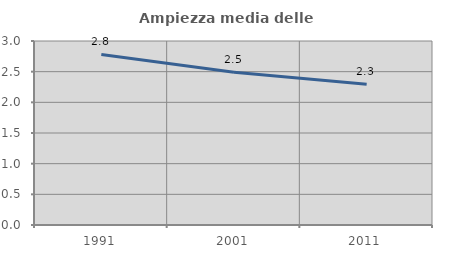
| Category | Ampiezza media delle famiglie |
|---|---|
| 1991.0 | 2.781 |
| 2001.0 | 2.49 |
| 2011.0 | 2.294 |